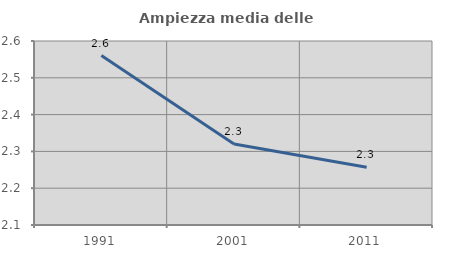
| Category | Ampiezza media delle famiglie |
|---|---|
| 1991.0 | 2.56 |
| 2001.0 | 2.32 |
| 2011.0 | 2.257 |